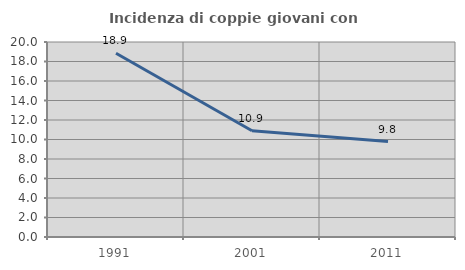
| Category | Incidenza di coppie giovani con figli |
|---|---|
| 1991.0 | 18.851 |
| 2001.0 | 10.904 |
| 2011.0 | 9.783 |